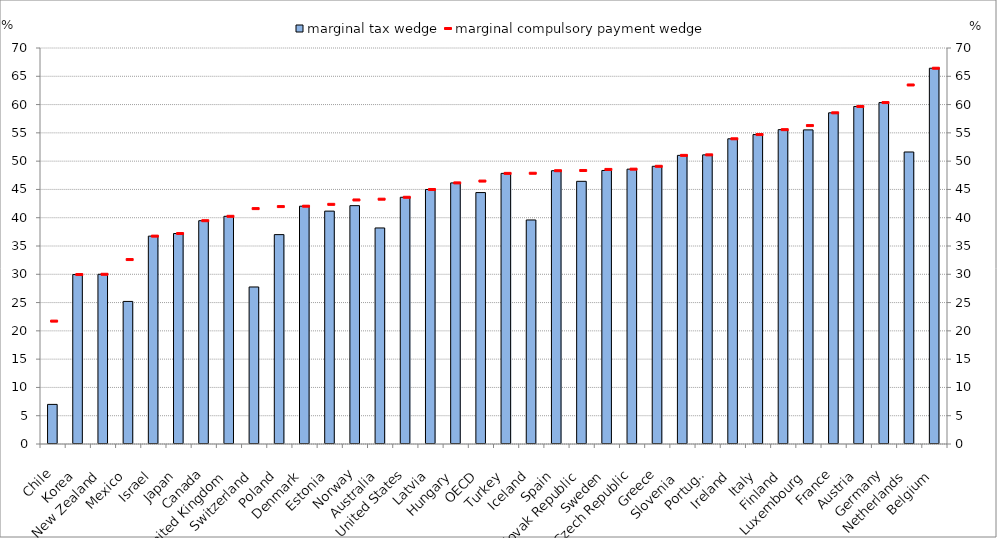
| Category | marginal tax wedge |
|---|---|
| Chile | 7 |
| Korea | 29.955 |
| New Zealand | 30 |
| Mexico | 25.203 |
| Israel | 36.744 |
| Japan | 37.205 |
| Canada | 39.473 |
| United Kingdom | 40.246 |
| Switzerland | 27.758 |
| Poland | 37.013 |
| Denmark | 42.034 |
| Estonia | 41.166 |
| Norway | 42.133 |
| Australia | 38.189 |
| United States | 43.614 |
| Latvia | 44.989 |
| Hungary | 46.154 |
| OECD | 44.444 |
| Turkey | 47.837 |
| Iceland | 39.6 |
| Spain | 48.309 |
| Slovak Republic | 46.433 |
| Sweden | 48.349 |
| Czech Republic | 48.582 |
| Greece | 49.087 |
| Slovenia  | 51.019 |
| Portugal | 51.111 |
| Ireland | 53.95 |
| Italy | 54.697 |
| Finland | 55.568 |
| Luxembourg | 55.525 |
| France | 58.542 |
| Austria | 59.664 |
| Germany | 60.352 |
| Netherlands | 51.617 |
| Belgium | 66.421 |